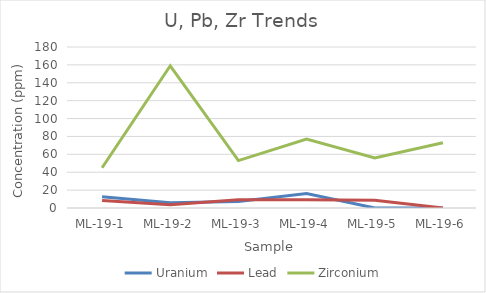
| Category | Uranium | Lead | Zirconium |
|---|---|---|---|
| ML-19-1 | 12.591 | 8.394 | 45 |
| ML-19-2 | 5.934 | 3.56 | 159 |
| ML-19-3 | 7.218 | 9.28 | 53 |
| ML-19-4 | 16.255 | 9.289 | 77 |
| ML-19-5 | 0 | 8.584 | 56 |
| ML-19-6 | 0 | 0 | 73 |